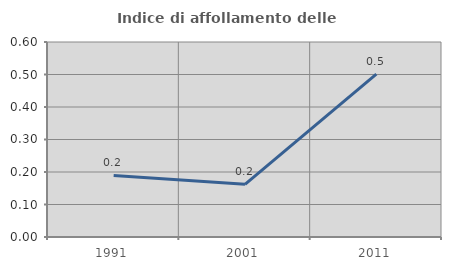
| Category | Indice di affollamento delle abitazioni  |
|---|---|
| 1991.0 | 0.189 |
| 2001.0 | 0.162 |
| 2011.0 | 0.501 |